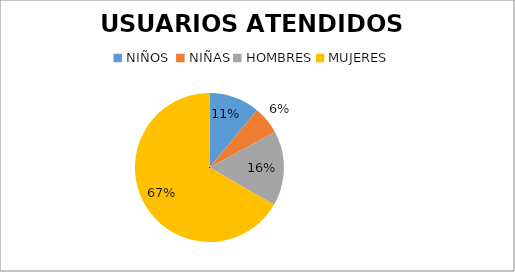
| Category | USUARIOS ATENDIDOS  PORCENTAJE | USUARIOS ATENDIDOS  CANTIDAD |
|---|---|---|
| NIÑOS  | 11.014 | 38 |
| NIÑAS | 6.087 | 21 |
| HOMBRES | 16.232 | 56 |
| MUJERES | 66.667 | 230 |